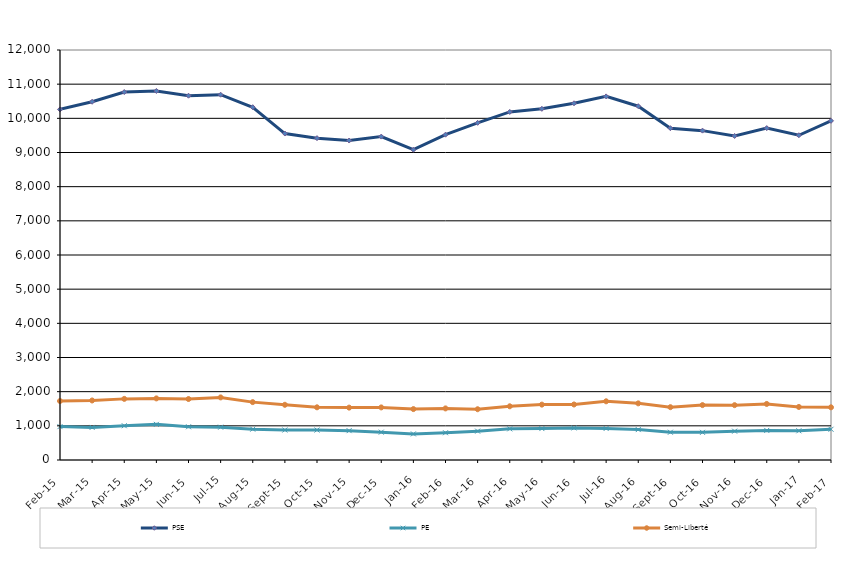
| Category | PSE | PE | Semi-Liberté |
|---|---|---|---|
| 2015-02-01 | 10261 | 977 | 1726 |
| 2015-03-01 | 10485 | 954 | 1742 |
| 2015-04-01 | 10770 | 1003 | 1789 |
| 2015-05-01 | 10801 | 1043 | 1803 |
| 2015-06-01 | 10662 | 973 | 1785 |
| 2015-07-01 | 10692 | 961 | 1832 |
| 2015-08-01 | 10325 | 903 | 1694 |
| 2015-09-01 | 9555 | 878 | 1616 |
| 2015-10-01 | 9420 | 877 | 1542 |
| 2015-11-01 | 9350 | 859 | 1533 |
| 2015-12-01 | 9466 | 815 | 1539 |
| 2016-01-01 | 9081 | 764 | 1490 |
| 2016-02-01 | 9521 | 798 | 1510 |
| 2016-03-01 | 9868 | 845 | 1486 |
| 2016-04-01 | 10187 | 912 | 1572 |
| 2016-05-01 | 10278 | 920 | 1621 |
| 2016-06-01 | 10441 | 939 | 1625 |
| 2016-07-01 | 10642 | 923 | 1718 |
| 2016-08-01 | 10355 | 890 | 1658 |
| 2016-09-01 | 9712 | 813 | 1546 |
| 2016-10-01 | 9640 | 809 | 1607 |
| 2016-11-01 | 9484 | 844 | 1605 |
| 2016-12-01 | 9714 | 866 | 1641 |
| 2017-01-01 | 9505 | 855 | 1553 |
| 2017-02-01 | 9927 | 900 | 1542 |